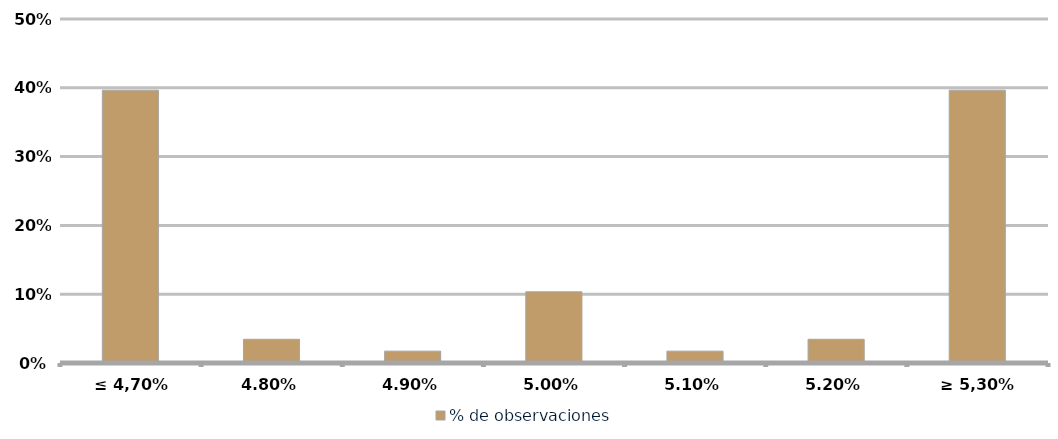
| Category | % de observaciones  |
|---|---|
| ≤ 4,70% | 0.397 |
| 4,80% | 0.034 |
| 4,90% | 0.017 |
| 5,00% | 0.103 |
| 5,10% | 0.017 |
| 5,20% | 0.034 |
| ≥ 5,30% | 0.397 |